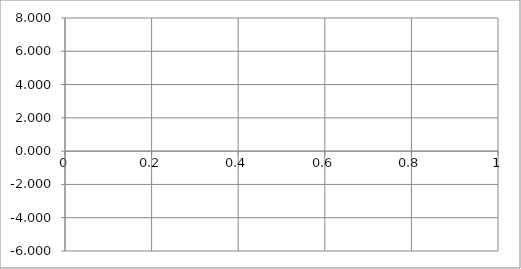
| Category | Vs |
|---|---|
| 0 | 0 |
| 1 | 3.542 |
| 2 | 5.841 |
| 3 | 6.225 |
| 4 | 4.853 |
| 5 | 2.555 |
| 6 | 0.341 |
| 7 | -1.118 |
| 8 | -1.763 |
| 9 | -2.024 |
| 10 | -2.414 |
| 11 | -3.107 |
| 12 | -3.763 |
| 13 | -3.731 |
| 14 | -2.487 |
| 15 | -0.058 |
| 16 | 2.853 |
| 17 | 5.143 |
| 18 | 5.841 |
| 19 | 4.624 |
| 20 | 2 |
| 21 | -0.928 |
| 22 | -3.013 |
| 23 | -3.612 |
| 24 | -2.853 |
| 25 | -1.472 |
| 26 | -0.341 |
| 27 | 0.036 |
| 28 | -0.237 |
| 29 | -0.589 |
| 30 | -0.414 |
| 31 | 0.493 |
| 32 | 1.763 |